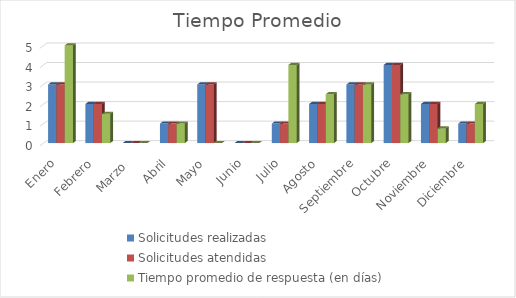
| Category | Solicitudes realizadas | Solicitudes atendidas | Tiempo promedio de respuesta (en días) |
|---|---|---|---|
| Enero | 3 | 3 | 5 |
| Febrero | 2 | 2 | 1.5 |
| Marzo  | 0 | 0 | 0 |
| Abril | 1 | 1 | 1 |
| Mayo | 3 | 3 | 0 |
| Junio | 0 | 0 | 0 |
| Julio | 1 | 1 | 4 |
| Agosto | 2 | 2 | 2.5 |
| Septiembre | 3 | 3 | 3 |
| Octubre | 4 | 4 | 2.5 |
| Noviembre | 2 | 2 | 0.75 |
| Diciembre | 1 | 1 | 2 |